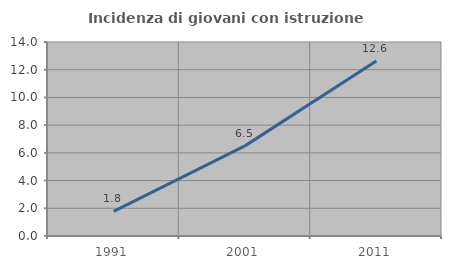
| Category | Incidenza di giovani con istruzione universitaria |
|---|---|
| 1991.0 | 1.778 |
| 2001.0 | 6.504 |
| 2011.0 | 12.632 |